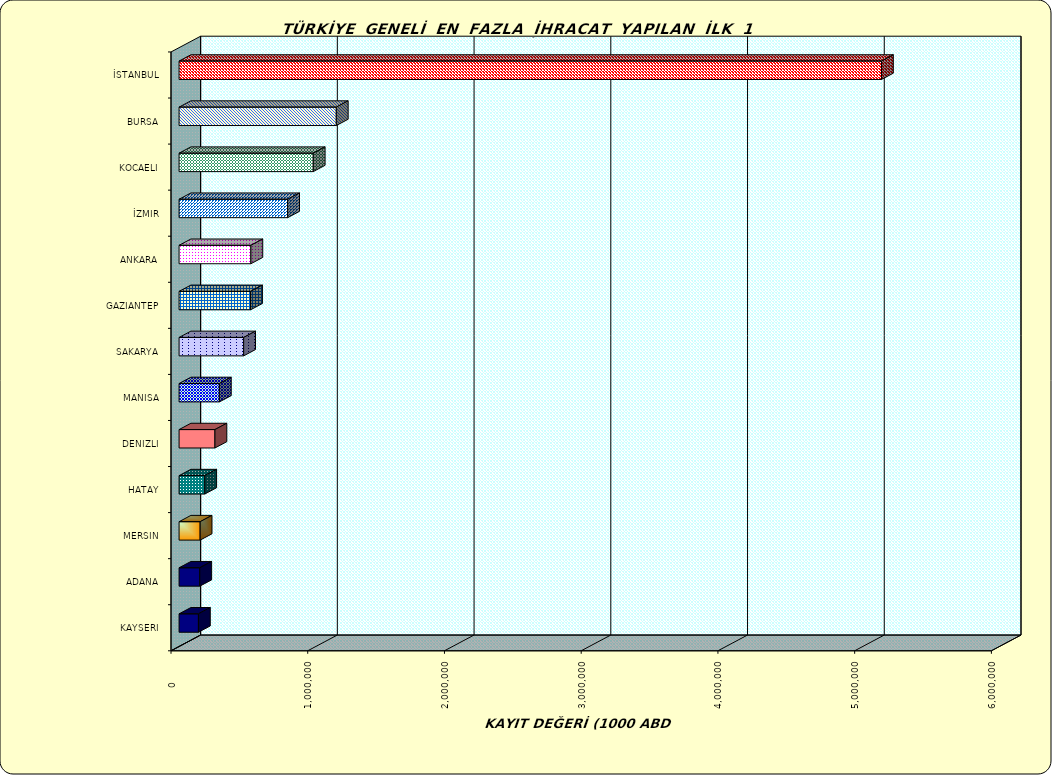
| Category | Series 0 |
|---|---|
| İSTANBUL | 5137158.009 |
| BURSA | 1149915.292 |
| KOCAELI | 981301.114 |
| İZMIR | 794032.501 |
| ANKARA | 525133.739 |
| GAZIANTEP | 522848.119 |
| SAKARYA | 472339.586 |
| MANISA | 294772.033 |
| DENIZLI | 262277.924 |
| HATAY | 187654.389 |
| MERSIN | 154031.887 |
| ADANA | 151332.9 |
| KAYSERI | 141509.337 |